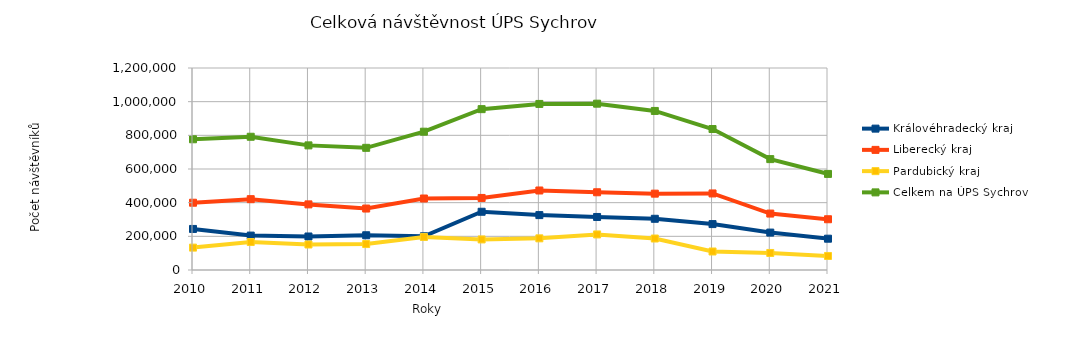
| Category | Královéhradecký kraj | Liberecký kraj | Pardubický kraj | Celkem na ÚPS Sychrov |
|---|---|---|---|---|
| 2010.0 | 243910 | 399672 | 133004 | 776586 |
| 2011.0 | 204481 | 420780 | 166238 | 791499 |
| 2012.0 | 199025 | 389781 | 151509 | 740315 |
| 2013.0 | 206419 | 365108 | 154165 | 725692 |
| 2014.0 | 200438 | 424718 | 196473 | 821629 |
| 2015.0 | 345970 | 428023 | 181567 | 955560 |
| 2016.0 | 326137 | 472318 | 188108 | 986563 |
| 2017.0 | 314983 | 461803 | 211268 | 988054 |
| 2018.0 | 304267 | 453568 | 187017 | 944852 |
| 2019.0 | 272720 | 454785 | 109949 | 837454 |
| 2020.0 | 222238 | 335261 | 101211 | 658710 |
| 2021.0 | 185934 | 301572 | 83321 | 570827 |